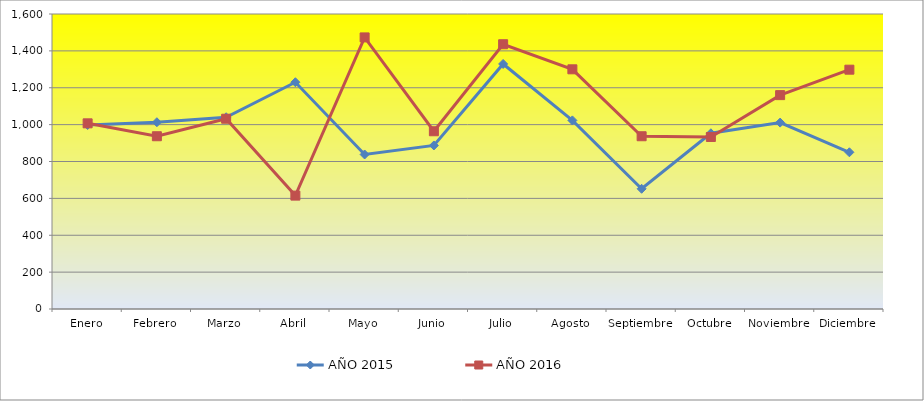
| Category | AÑO 2015 | AÑO 2016 |
|---|---|---|
| Enero | 998 | 1007 |
| Febrero | 1013 | 937 |
| Marzo | 1040 | 1032 |
| Abril | 1230 | 615 |
| Mayo | 838 | 1473 |
| Junio | 887 | 964 |
| Julio | 1329 | 1436 |
| Agosto | 1023 | 1300 |
| Septiembre | 652 | 937 |
| Octubre | 953 | 933 |
| Noviembre | 1011 | 1160 |
| Diciembre | 850 | 1298 |